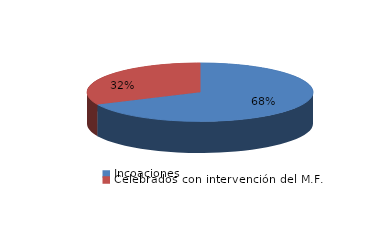
| Category | Series 0 |
|---|---|
| Incoaciones | 5685 |
| Celebrados con intervención del M.F. | 2671 |